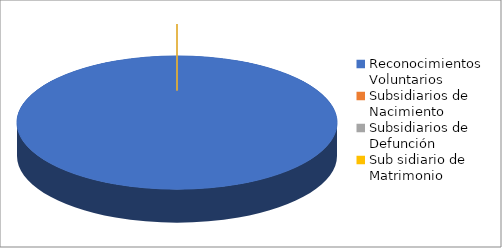
| Category | Series 0 |
|---|---|
| Reconocimientos Voluntarios  | 1 |
| Subsidiarios de Nacimiento | 0 |
| Subsidiarios de Defunción | 0 |
| Sub sidiario de Matrimonio | 0 |